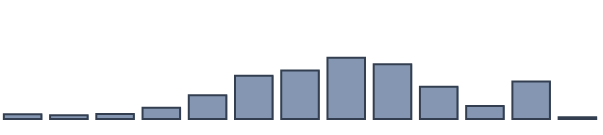
| Category | Series 0 |
|---|---|
| 0 | 1.4 |
| 1 | 1.1 |
| 2 | 1.5 |
| 3 | 3.3 |
| 4 | 7 |
| 5 | 12.7 |
| 6 | 14.3 |
| 7 | 18 |
| 8 | 16.1 |
| 9 | 9.5 |
| 10 | 3.8 |
| 11 | 11 |
| 12 | 0.5 |